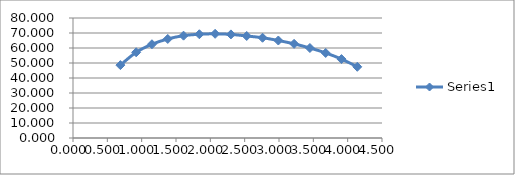
| Category | Series 0 |
|---|---|
| 0.69 | 48.592 |
| 0.9199999999999999 | 57.143 |
| 1.15 | 62.5 |
| 1.38 | 66.029 |
| 1.6099999999999999 | 68.22 |
| 1.8399999999999999 | 69.173 |
| 2.07 | 69.463 |
| 2.3 | 69.069 |
| 2.53 | 68.011 |
| 2.76 | 66.828 |
| 2.9899999999999998 | 65 |
| 3.2199999999999998 | 62.768 |
| 3.4499999999999997 | 60 |
| 3.6799999999999997 | 56.703 |
| 3.9099999999999997 | 52.624 |
| 4.14 | 47.477 |